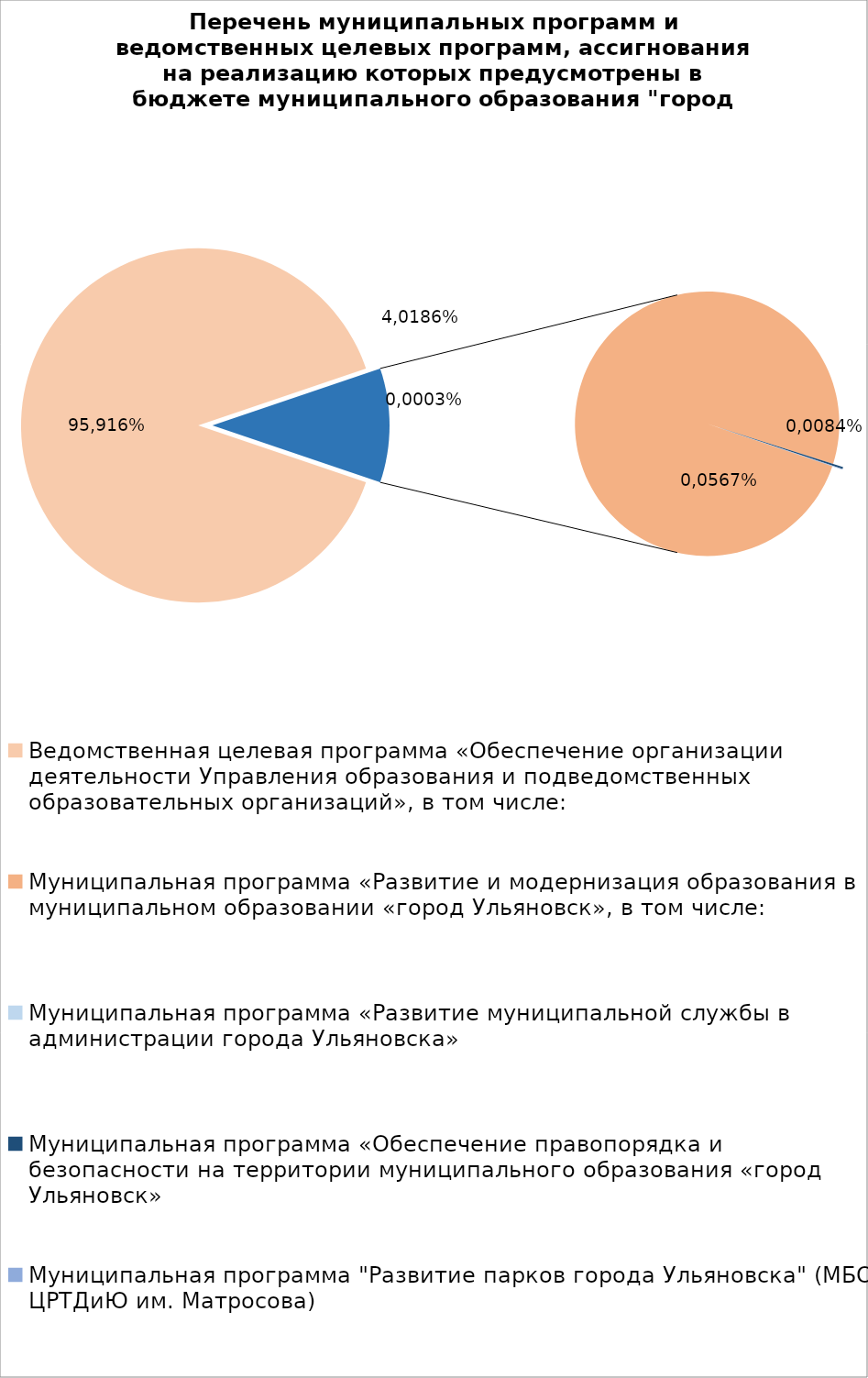
| Category | Series 0 |
|---|---|
| Ведомственная целевая программа «Обеспечение организации деятельности Управления образования и подведомственных образовательных организаций», в том числе: | 7849026.08 |
| Муниципальная программа «Развитие и модернизация образования в муниципальном образовании «город Ульяновск», в том числе: | 909739.44 |
| Муниципальная программа «Развитие муниципальной службы в администрации города Ульяновска» | 14.3 |
| Муниципальная программа «Обеспечение правопорядка и безопасности на территории муниципального образования «город Ульяновск» | 2100.73 |
| Муниципальная программа "Развитие парков города Ульяновска" (МБОУ ЦРТДиЮ им. Матросова) | 600 |